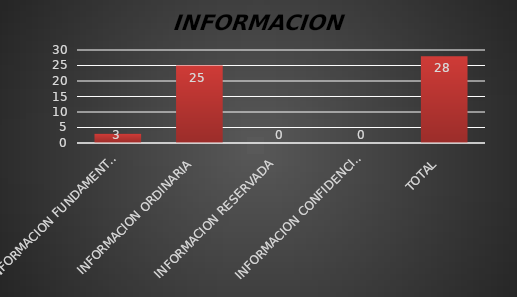
| Category | Series 1 |
|---|---|
| INFORMACION FUNDAMENTAL  | 3 |
| INFORMACION ORDINARIA  | 25 |
| INFORMACION RESERVADA  | 0 |
| INFORMACION CONFIDENCIAL  | 0 |
| TOTAL  | 28 |